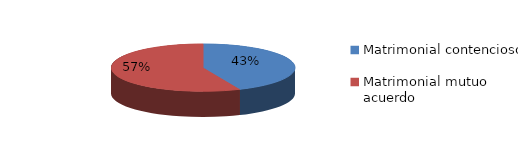
| Category | Series 0 |
|---|---|
| 0 | 767 |
| 1 | 998 |